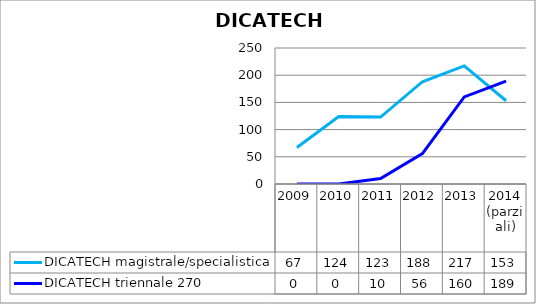
| Category | DICATECH magistrale/specialistica | DICATECH triennale 270 |
|---|---|---|
| 2009 | 67 | 0 |
| 2010 | 124 | 0 |
| 2011 | 123 | 10 |
| 2012 | 188 | 56 |
| 2013 | 217 | 160 |
| 2014
(parziali) | 153 | 189 |